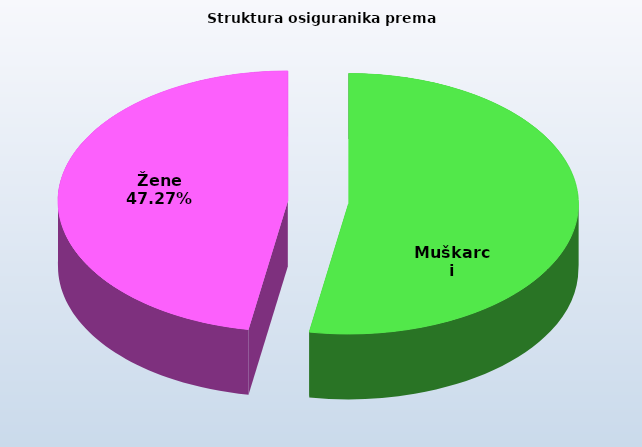
| Category | Series 0 |
|---|---|
| Muškarci | 811374 |
| Žene | 727247 |